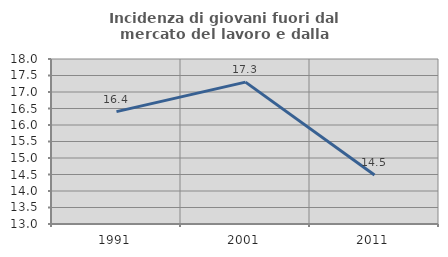
| Category | Incidenza di giovani fuori dal mercato del lavoro e dalla formazione  |
|---|---|
| 1991.0 | 16.406 |
| 2001.0 | 17.299 |
| 2011.0 | 14.485 |